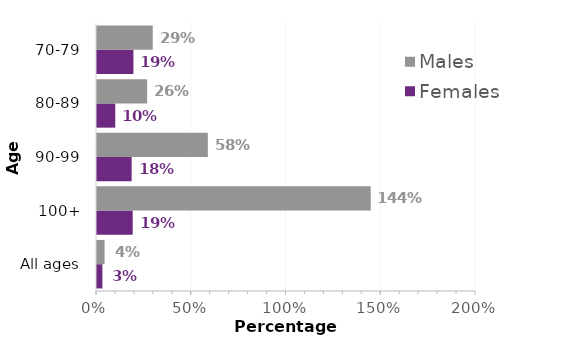
| Category | Females | Males |
|---|---|---|
| All ages | 0.028 | 0.04 |
| 100+ | 0.188 | 1.444 |
| 90-99 | 0.183 | 0.585 |
| 80-89 | 0.096 | 0.265 |
| 70-79 | 0.192 | 0.294 |